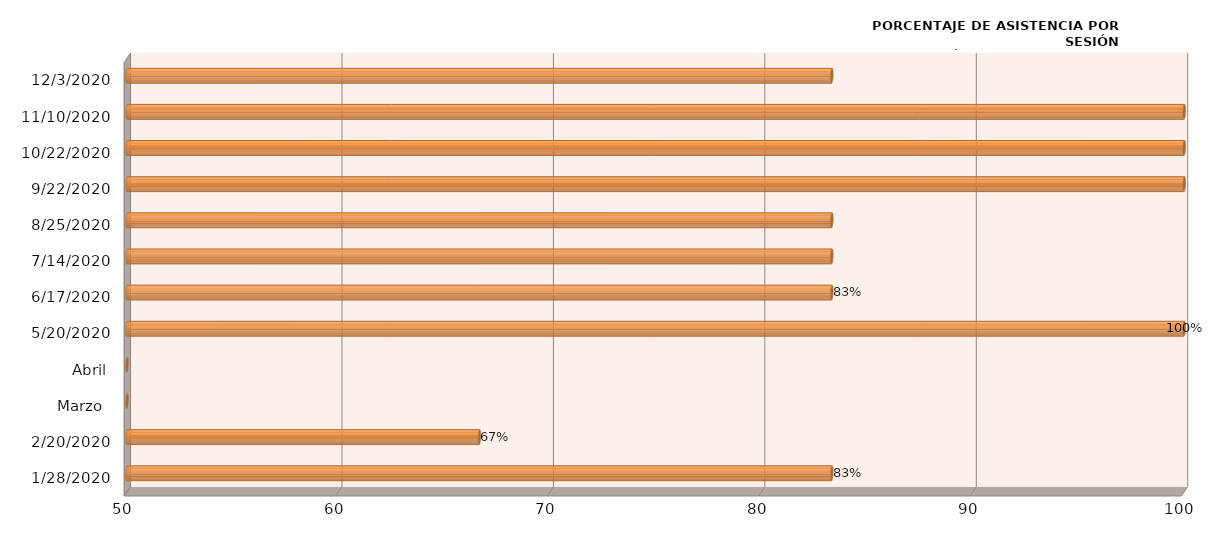
| Category | Series 0 |
|---|---|
| 28/01/2020 | 83.333 |
| 20/02/2020 | 66.667 |
| Marzo  | 0 |
| Abril | 0 |
| 20/05/2020 | 100 |
| 17/06/2020 | 83.333 |
| 14/07/2020 | 83.333 |
| 25/08/2020 | 83.333 |
| 22/09/2020 | 100 |
| 22/10/2020 | 100 |
| 10/11/2020 | 100 |
| 03/12/2020 | 83.333 |